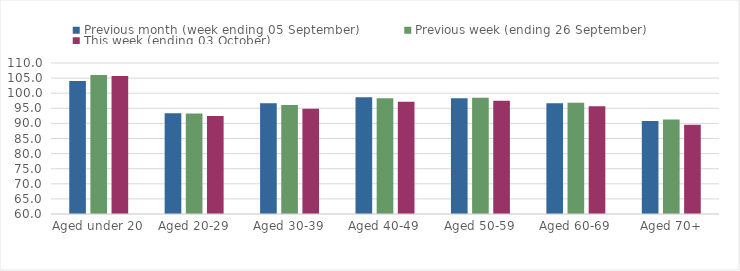
| Category | Previous month (week ending 05 September) | Previous week (ending 26 September) | This week (ending 03 October) |
|---|---|---|---|
| Aged under 20 | 104.08 | 106.02 | 105.71 |
| Aged 20-29 | 93.37 | 93.27 | 92.46 |
| Aged 30-39 | 96.66 | 96.06 | 94.86 |
| Aged 40-49 | 98.64 | 98.29 | 97.16 |
| Aged 50-59 | 98.32 | 98.47 | 97.49 |
| Aged 60-69 | 96.67 | 96.86 | 95.66 |
| Aged 70+ | 90.8 | 91.33 | 89.53 |